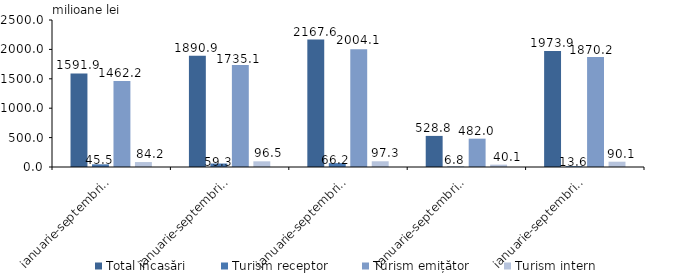
| Category | Total încasări | Turism receptor | Turism emițător | Turism intern |
|---|---|---|---|---|
| ianuarie-septembrie 2017 | 1591.868 | 45.456 | 1462.217 | 84.195 |
| ianuarie-septembrie 2018 | 1890.884 | 59.277 | 1735.065 | 96.542 |
| ianuarie-septembrie 2019 | 2167.619 | 66.247 | 2004.071 | 97.315 |
| ianuarie-septembrie 2020 | 528.845 | 6.815 | 481.964 | 40.066 |
| ianuarie-septembrie 2021 | 1973.932 | 13.629 | 1870.177 | 90.126 |